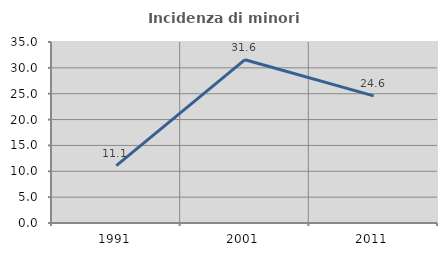
| Category | Incidenza di minori stranieri |
|---|---|
| 1991.0 | 11.111 |
| 2001.0 | 31.579 |
| 2011.0 | 24.59 |